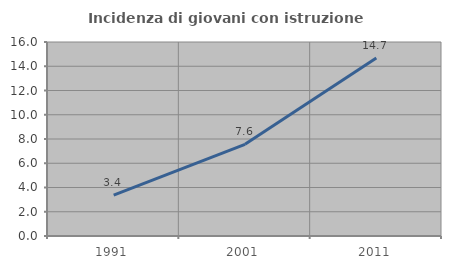
| Category | Incidenza di giovani con istruzione universitaria |
|---|---|
| 1991.0 | 3.371 |
| 2001.0 | 7.558 |
| 2011.0 | 14.689 |